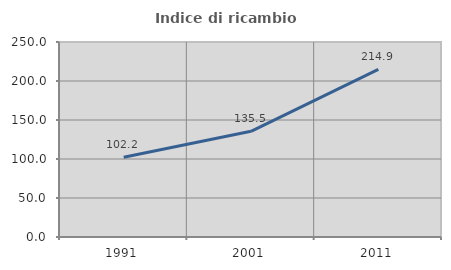
| Category | Indice di ricambio occupazionale  |
|---|---|
| 1991.0 | 102.212 |
| 2001.0 | 135.519 |
| 2011.0 | 214.894 |